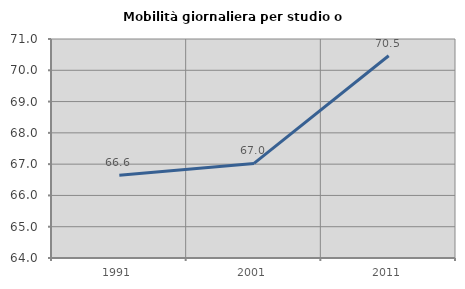
| Category | Mobilità giornaliera per studio o lavoro |
|---|---|
| 1991.0 | 66.644 |
| 2001.0 | 67.022 |
| 2011.0 | 70.464 |